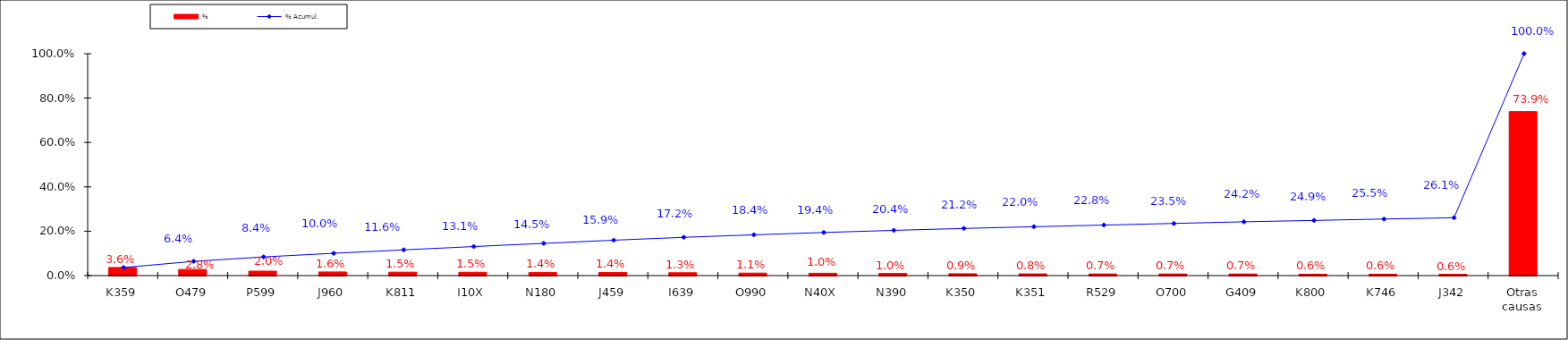
| Category | % |
|---|---|
| K359 | 0.036 |
| O479 | 0.028 |
| P599 | 0.02 |
| J960 | 0.016 |
| K811 | 0.015 |
| I10X | 0.015 |
| N180 | 0.014 |
| J459 | 0.014 |
| I639 | 0.013 |
| O990 | 0.011 |
| N40X | 0.01 |
| N390 | 0.01 |
| K350 | 0.009 |
| K351 | 0.008 |
| R529 | 0.007 |
| O700 | 0.007 |
| G409 | 0.007 |
| K800 | 0.006 |
| K746 | 0.006 |
| J342 | 0.006 |
| Otras causas | 0.739 |